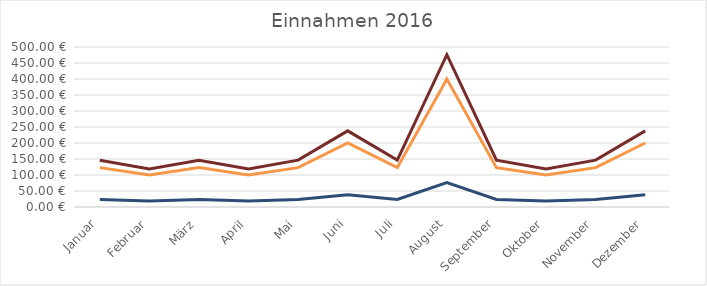
| Category | Series 5 | Series 6 | Series 7 |
|---|---|---|---|
| Januar | 123 | 23.37 | 146.37 |
| Februar | 100 | 19 | 119 |
| März | 123 | 23.37 | 146.37 |
| April | 100 | 19 | 119 |
| Mai | 123 | 23.37 | 146.37 |
| Juni | 200 | 38 | 238 |
| Juli | 123 | 23.37 | 146.37 |
| August | 400 | 76 | 476 |
| September | 123 | 23.37 | 146.37 |
| Oktober | 100 | 19 | 119 |
| November | 123 | 23.37 | 146.37 |
| Dezember | 200 | 38 | 238 |